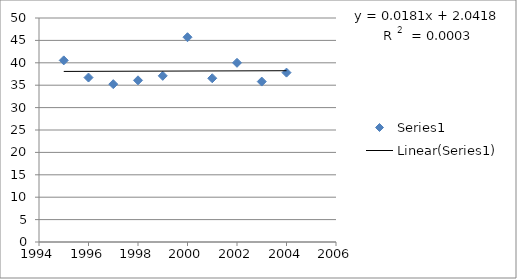
| Category | Series 0 |
|---|---|
| 1995.0 | 40.54 |
| 1996.0 | 36.71 |
| 1997.0 | 35.23 |
| 1998.0 | 36.09 |
| 1999.0 | 37.09 |
| 2000.0 | 45.71 |
| 2001.0 | 36.55 |
| 2002.0 | 40 |
| 2003.0 | 35.81 |
| 2004.0 | 37.81 |